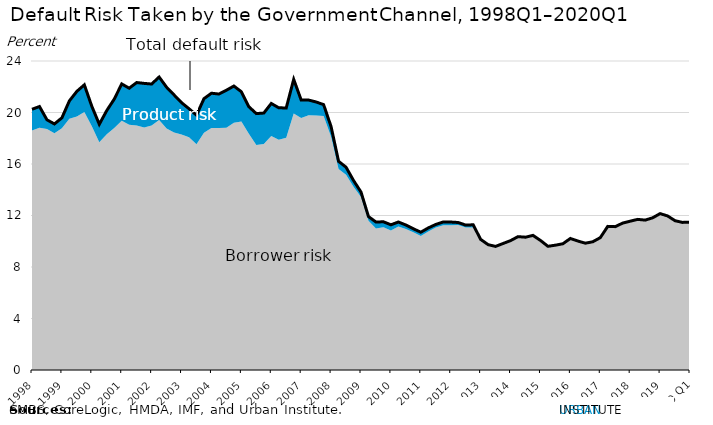
| Category | Series 2 |
|---|---|
| 1998 | 20.249 |
| 1998 | 20.465 |
| 1998 | 19.432 |
| 1998 | 19.111 |
| 1999 | 19.587 |
| 1999 | 20.904 |
| 1999 | 21.644 |
| 1999 | 22.15 |
| 2000 | 20.48 |
| 2000 | 19.085 |
| 2000 | 20.153 |
| 2000 | 21.041 |
| 2001 | 22.218 |
| 2001 | 21.887 |
| 2001 | 22.326 |
| 2001 | 22.261 |
| 2002 | 22.21 |
| 2002 | 22.756 |
| 2002 | 21.964 |
| 2002 | 21.365 |
| 2003 | 20.765 |
| 2003 | 20.293 |
| 2003 | 19.795 |
| 2003 | 21.076 |
| 2004 | 21.499 |
| 2004 | 21.434 |
| 2004 | 21.731 |
| 2004 | 22.055 |
| 2005 | 21.612 |
| 2005 | 20.449 |
| 2005 | 19.915 |
| 2005 | 19.957 |
| 2006 | 20.702 |
| 2006 | 20.366 |
| 2006 | 20.352 |
| 2006 | 22.574 |
| 2007 | 20.969 |
| 2007 | 20.966 |
| 2007 | 20.816 |
| 2007 | 20.612 |
| 2008 | 18.9 |
| 2008 | 16.212 |
| 2008 | 15.75 |
| 2008 | 14.72 |
| 2009 | 13.823 |
| 2009 | 11.918 |
| 2009 | 11.493 |
| 2009 | 11.512 |
| 2010 | 11.277 |
| 2010 | 11.496 |
| 2010 | 11.262 |
| 2010 | 10.969 |
| 2011 | 10.703 |
| 2011 | 11.034 |
| 2011 | 11.306 |
| 2011 | 11.499 |
| 2012 | 11.492 |
| 2012 | 11.457 |
| 2012 | 11.255 |
| 2012 | 11.279 |
| 2013 | 10.148 |
| 2013 | 9.735 |
| 2013 | 9.6 |
| 2013 | 9.826 |
| 2014 | 10.048 |
| 2014 | 10.359 |
| 2014 | 10.315 |
| 2014 | 10.455 |
| 2015 | 10.065 |
| 2015 | 9.607 |
| 2015 | 9.695 |
| 2015 | 9.805 |
| 2016 | 10.217 |
| 2016 | 10.017 |
| 2016 | 9.849 |
| 2016 | 9.96 |
| 2017 | 10.28 |
| 2017 | 11.154 |
| 2017 | 11.134 |
| 2017 | 11.411 |
| 2018 | 11.558 |
| 2018 | 11.7 |
| 2018 | 11.641 |
| 2018 | 11.82 |
| 2019 | 12.146 |
| 2019 | 11.968 |
| 2019 | 11.595 |
| 2019 | 11.463 |
| 2020 Q1 | 11.488 |